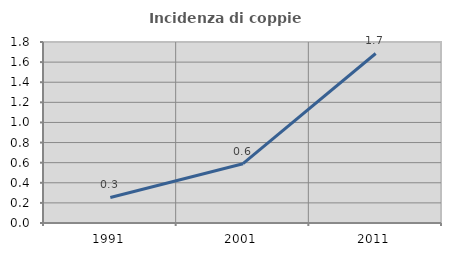
| Category | Incidenza di coppie miste |
|---|---|
| 1991.0 | 0.254 |
| 2001.0 | 0.59 |
| 2011.0 | 1.686 |